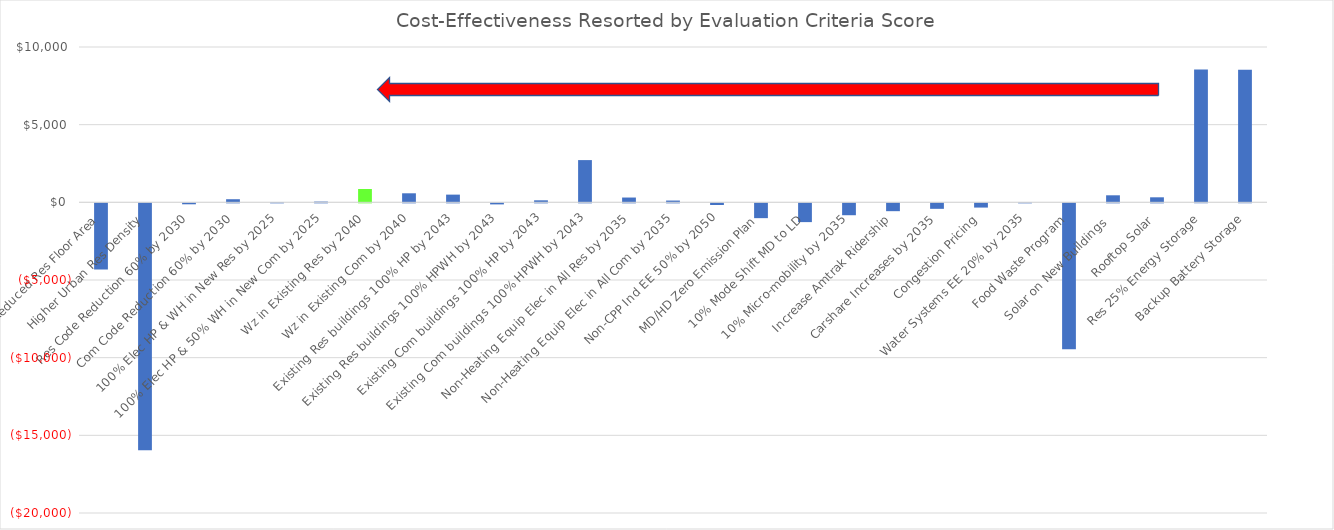
| Category | Series 0 |
|---|---|
| Reduced Res Floor Area | -4261.302 |
| Higher Urban Res Density | -15898.512 |
| Res Code Reduction 60% by 2030 | -62.073 |
| Com Code Reduction 60% by 2030 | 200.249 |
| 100% Elec HP & WH in New Res by 2025 | 19.051 |
| 100% Elec HP & 50% WH in New Com by 2025 | 47.893 |
| Wz in Existing Res by 2040 | 858.86 |
| Wz in Existing Com by 2040 | 582.11 |
| Existing Res buildings 100% HP by 2043 | 496.359 |
| Existing Res buildings 100% HPWH by 2043 | -68.668 |
| Existing Com buildings 100% HP by 2043 | 129.961 |
| Existing Com buildings 100% HPWH by 2043 | 2719.258 |
| Non-Heating Equip Elec in All Res by 2035 | 309.247 |
| Non-Heating Equip Elec in All Com by 2035 | 114.78 |
| Non-CPP Ind EE 50% by 2050 | -109.028 |
| MD/HD Zero Emission Plan | -953.888 |
| 10% Mode Shift MD to LD | -1208.946 |
| 10% Micro-mobility by 2035 | -765.701 |
| Increase Amtrak Ridership | -504.985 |
| Carshare Increases by 2035 | -353.867 |
| Congestion Pricing | -272.995 |
| Water Systems EE 20% by 2035 | 0.73 |
| Food Waste Program | -9393 |
| Solar on New Buildings  | 453.001 |
| Rooftop Solar | 323.77 |
| Res 25% Energy Storage | 8548.112 |
| Backup Battery Storage | 8532.469 |